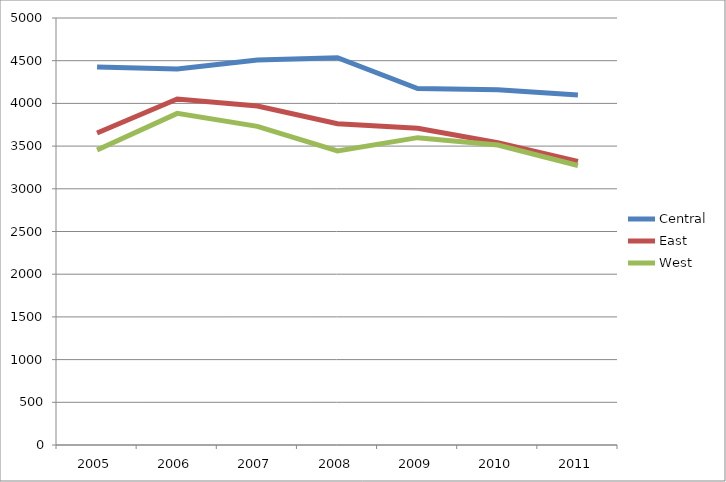
| Category | Central | East | West |
|---|---|---|---|
| 2005.0 | 4427 | 3654 | 3454 |
| 2006.0 | 4402 | 4052 | 3883 |
| 2007.0 | 4508 | 3969 | 3731 |
| 2008.0 | 4535 | 3762 | 3444 |
| 2009.0 | 4174 | 3708 | 3599 |
| 2010.0 | 4159 | 3540 | 3512 |
| 2011.0 | 4097 | 3321 | 3273 |